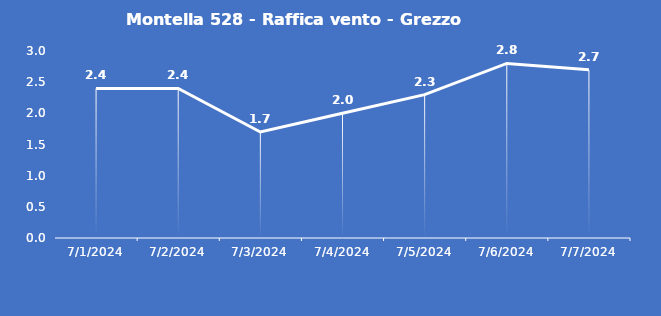
| Category | Montella 528 - Raffica vento - Grezzo (m/s) |
|---|---|
| 7/1/24 | 2.4 |
| 7/2/24 | 2.4 |
| 7/3/24 | 1.7 |
| 7/4/24 | 2 |
| 7/5/24 | 2.3 |
| 7/6/24 | 2.8 |
| 7/7/24 | 2.7 |